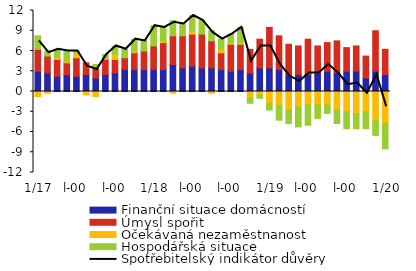
| Category | Finanční situace domácností | Úmysl spořit | Očekávaná nezaměstnanost | Hospodářská situace |
|---|---|---|---|---|
|  1/17 | 3 | 3.25 | -0.75 | 2 |
| 2 | 2.75 | 2.5 | -0.25 | 0.75 |
| 3 | 2.25 | 2.5 | 0.25 | 1.25 |
| 4 | 2.5 | 1.75 | 0.25 | 1.5 |
| 5 | 2.25 | 2.75 | 0.75 | 0.25 |
| 6 | 2.5 | 1.75 | -0.5 | 0 |
| 7 | 2 | 1.5 | -0.75 | 0.5 |
| 8 | 2.5 | 2.25 | 0 | 0.75 |
| 9 | 2.75 | 2 | 0.75 | 1.25 |
| 10 | 3.25 | 1.75 | 0 | 1.25 |
| 11 | 3.25 | 2.5 | 0.25 | 1.75 |
| 12 | 3.25 | 2.75 | 0 | 1.5 |
|  1/18 | 3.25 | 3.5 | 0 | 3 |
| 2 | 3.25 | 4 | 0.25 | 2 |
| 3 | 4 | 4.25 | -0.25 | 2.25 |
| 4 | 3.5 | 4.75 | 0 | 1.75 |
| 5 | 3.75 | 4.75 | 0.5 | 2.25 |
| 6 | 3.5 | 5 | 0 | 2 |
| 7 | 3.5 | 4 | -0.25 | 1.5 |
| 8 | 3.25 | 2.5 | 0.5 | 1.5 |
| 9 | 3 | 4 | 0.25 | 1.25 |
| 10 | 3.25 | 3.75 | 0.25 | 2.25 |
| 11 | 2.75 | 3.5 | -1 | -0.75 |
| 12 | 3.5 | 4.25 | -0.5 | -0.5 |
|  1/19 | 3.5 | 6 | -1.75 | -1 |
| 2 | 3.25 | 5 | -2 | -2.25 |
| 3 | 2.5 | 4.5 | -2.75 | -2 |
| 4 | 2.5 | 4.25 | -2.25 | -3 |
| 5 | 2.5 | 5.25 | -2 | -3 |
| 6 | 2.75 | 4 | -2 | -2 |
| 7 | 3 | 4.25 | -2 | -1.25 |
| 8 | 2.75 | 4.75 | -2.75 | -2 |
| 9 | 3 | 3.5 | -3 | -2.5 |
| 10 | 3 | 3.75 | -3.25 | -2.25 |
| 11 | 2 | 3.25 | -3 | -2.5 |
| 12 | 3 | 6 | -4.25 | -2.25 |
|  1/20 | 2.5 | 3.75 | -4.75 | -3.75 |